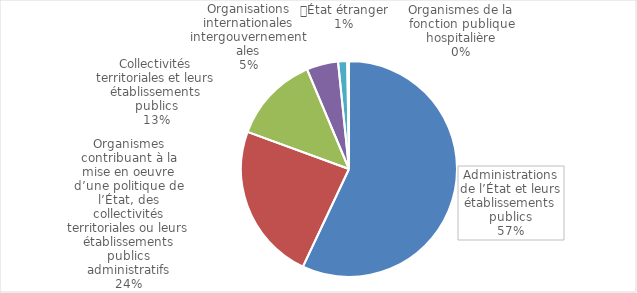
| Category | mise à disposition |
|---|---|
| Administrations de l’État et leurs établissements publics | 1970 |
| Organismes contribuant à la mise en oeuvre d’une politique de l’État, des collectivités territoriales ou leurs établissements publics administratifs | 814 |
| Collectivités territoriales et leurs établissements publics | 452 |
| Organisations internationales intergouvernementales | 163 |
| État étranger | 47 |
| Organismes de la fonction publique hospitalière | 9 |